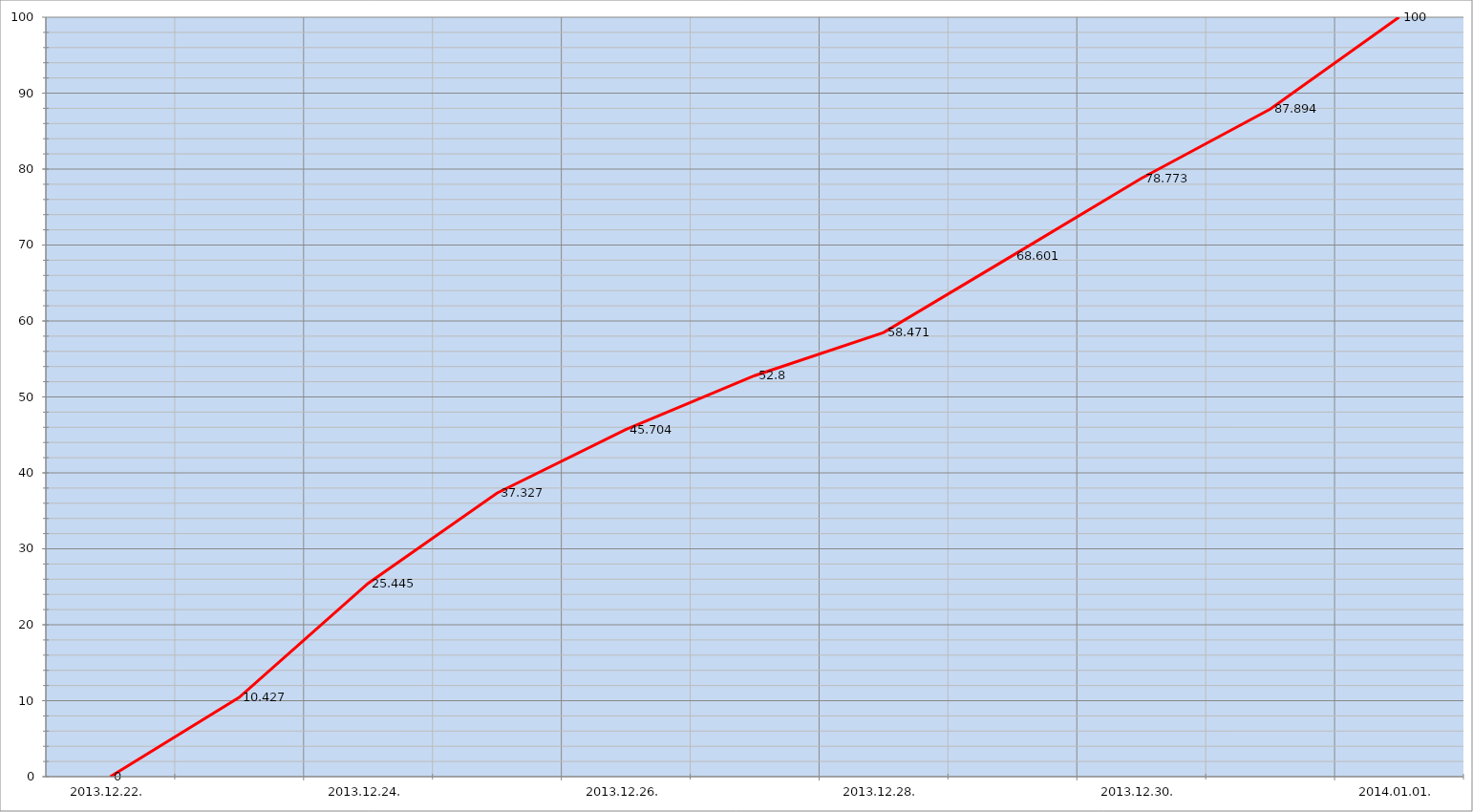
| Category | Szerver 7 |
|---|---|
| 2013-12-22 | 0 |
| 2013-12-23 | 10.427 |
| 2013-12-24 | 25.445 |
| 2013-12-25 | 37.327 |
| 2013-12-26 | 45.704 |
| 2013-12-27 | 52.8 |
| 2013-12-28 | 58.471 |
| 2013-12-29 | 68.601 |
| 2013-12-30 | 78.773 |
| 2013-12-31 | 87.894 |
| 2014-01-01 | 100 |